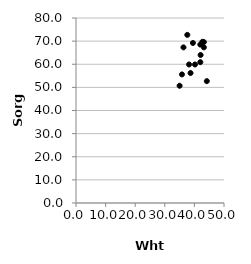
| Category | Series 0 |
|---|---|
| 38.2 | 59.9 |
| 37.6 | 72.7 |
| 35.8 | 55.6 |
| 36.3 | 67.3 |
| 39.5 | 69.2 |
| 43.2 | 67.3 |
| 42.7 | 69.7 |
| 42.0 | 60.9 |
| 40.2 | 59.9 |
| 35.0 | 50.7 |
| 44.2 | 52.7 |
| 43.2 | 69.6 |
| 42.0 | 68.5 |
| 38.7 | 56.2 |
| 42.1 | 64 |